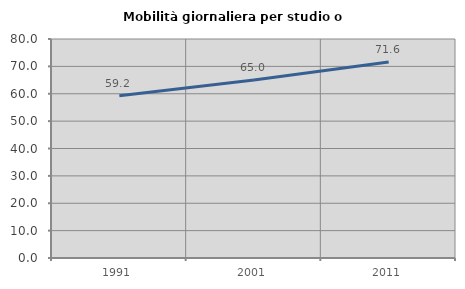
| Category | Mobilità giornaliera per studio o lavoro |
|---|---|
| 1991.0 | 59.247 |
| 2001.0 | 65.042 |
| 2011.0 | 71.593 |